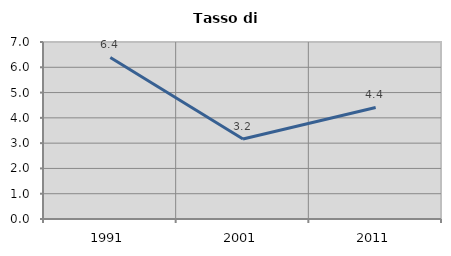
| Category | Tasso di disoccupazione   |
|---|---|
| 1991.0 | 6.388 |
| 2001.0 | 3.161 |
| 2011.0 | 4.41 |